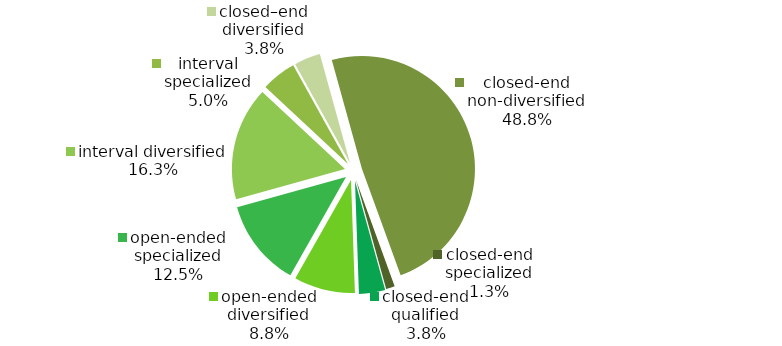
| Category | Series 0 |
|---|---|
| open-ended diversified | 7 |
| open-ended specialized | 10 |
| interval diversified | 13 |
| interval specialized | 4 |
| closed–end diversified | 3 |
| closed-end non-diversified | 39 |
| closed-end specialized | 1 |
| closed-end qualified | 3 |